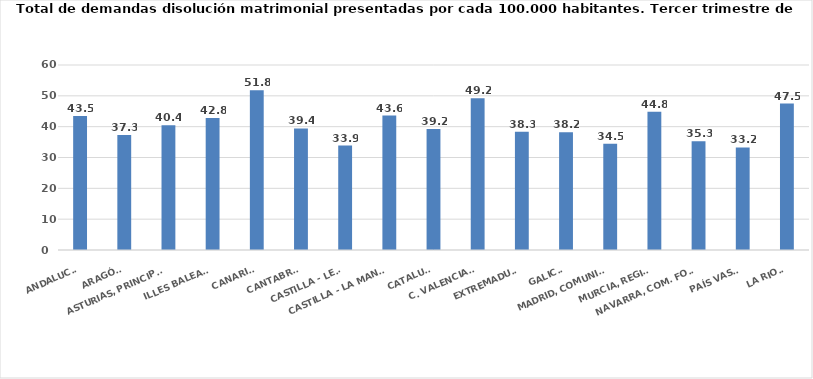
| Category | Series 0 |
|---|---|
| ANDALUCÍA | 43.498 |
| ARAGÓN | 37.278 |
| ASTURIAS, PRINCIPADO | 40.433 |
| ILLES BALEARS | 42.843 |
| CANARIAS | 51.832 |
| CANTABRIA | 39.42 |
| CASTILLA - LEÓN | 33.871 |
| CASTILLA - LA MANCHA | 43.593 |
| CATALUÑA | 39.22 |
| C. VALENCIANA | 49.193 |
| EXTREMADURA | 38.319 |
| GALICIA | 38.189 |
| MADRID, COMUNIDAD | 34.458 |
| MURCIA, REGIÓN | 44.826 |
| NAVARRA, COM. FORAL | 35.257 |
| PAÍS VASCO | 33.245 |
| LA RIOJA | 47.477 |